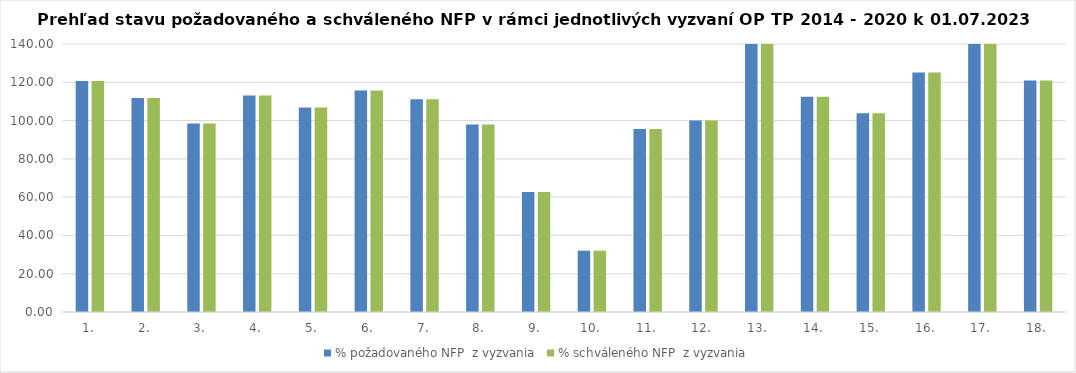
| Category | % požadovaného NFP  z vyzvania | % schváleného NFP  z vyzvania |
|---|---|---|
| 1. | 120.673 | 120.673 |
| 2. | 111.84 | 111.84 |
| 3. | 98.474 | 98.474 |
| 4. | 113.162 | 113.162 |
| 5. | 106.767 | 106.767 |
| 6. | 115.745 | 115.745 |
| 7. | 111.089 | 111.089 |
| 8. | 97.998 | 97.998 |
| 9. | 62.727 | 62.727 |
| 10. | 32.041 | 32.041 |
| 11. | 95.621 | 95.621 |
| 12. | 100.009 | 100.009 |
| 13. | 151.956 | 151.956 |
| 14. | 112.426 | 112.426 |
| 15. | 103.766 | 103.766 |
| 16. | 125.057 | 125.057 |
| 17. | 171.931 | 171.931 |
| 18. | 120.879 | 120.879 |